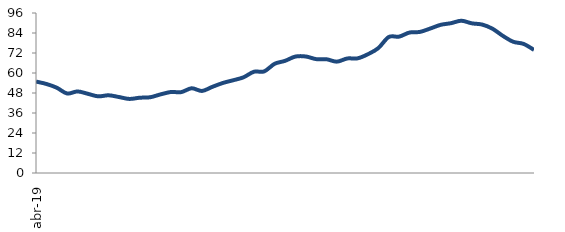
| Category | Series 0 |
|---|---|
| 2019-04-01 | 54.855 |
| 2019-05-01 | 53.426 |
| 2019-06-01 | 51.167 |
| 2019-07-01 | 47.705 |
| 2019-08-01 | 48.94 |
| 2019-09-01 | 47.515 |
| 2019-10-01 | 45.989 |
| 2019-11-01 | 46.631 |
| 2019-12-01 | 45.576 |
| 2020-01-01 | 44.444 |
| 2020-02-01 | 45.166 |
| 2020-03-01 | 45.444 |
| 2020-04-01 | 47.162 |
| 2020-05-01 | 48.595 |
| 2020-06-01 | 48.53 |
| 2020-07-01 | 50.83 |
| 2020-08-01 | 49.231 |
| 2020-09-01 | 51.699 |
| 2020-10-01 | 53.991 |
| 2020-11-01 | 55.639 |
| 2020-12-01 | 57.413 |
| 2021-01-01 | 60.742 |
| 2021-02-01 | 60.984 |
| 2021-03-01 | 65.524 |
| 2021-04-01 | 67.28 |
| 2021-05-01 | 69.863 |
| 2021-06-01 | 69.912 |
| 2021-07-01 | 68.331 |
| 2021-08-01 | 68.248 |
| 2021-09-01 | 66.807 |
| 2021-10-01 | 68.707 |
| 2021-11-01 | 68.802 |
| 2021-12-01 | 71.282 |
| 2022-01-01 | 74.964 |
| 2022-02-01 | 81.594 |
| 2022-03-01 | 81.823 |
| 2022-04-01 | 84.283 |
| 2022-05-01 | 84.65 |
| 2022-06-01 | 86.683 |
| 2022-07-01 | 88.894 |
| 2022-08-01 | 89.887 |
| 2022-09-01 | 91.356 |
| 2022-10-01 | 89.801 |
| 2022-11-01 | 89.064 |
| 2022-12-01 | 86.562 |
| 2023-01-01 | 82.272 |
| 2023-02-01 | 78.738 |
| 2023-03-01 | 77.447 |
| 2023-04-01 | 73.856 |